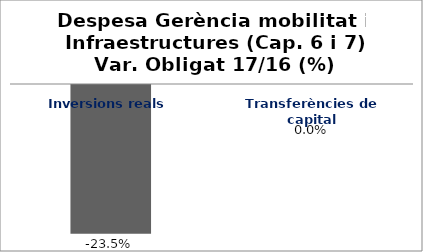
| Category | Series 0 |
|---|---|
| Inversions reals | -0.235 |
| Transferències de capital | 0 |